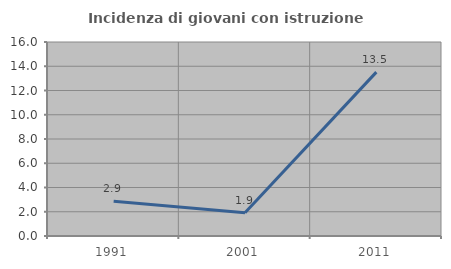
| Category | Incidenza di giovani con istruzione universitaria |
|---|---|
| 1991.0 | 2.857 |
| 2001.0 | 1.923 |
| 2011.0 | 13.514 |